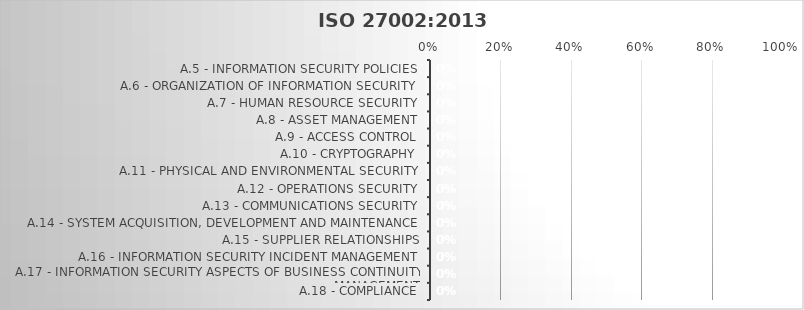
| Category | Implementation Score: |
|---|---|
| A.5 - Information Security Policies | 0 |
| A.6 - Organization of information security | 0 |
| A.7 - Human resource security | 0 |
| A.8 - Asset management | 0 |
| A.9 - Access control | 0 |
| A.10 - Cryptography | 0 |
| A.11 - Physical and environmental security | 0 |
| A.12 - Operations security | 0 |
| A.13 - Communications security | 0 |
| A.14 - System acquisition, development and maintenance | 0 |
| A.15 - Supplier relationships | 0 |
| A.16 - Information security incident management | 0 |
| A.17 - Information security aspects of business continuity management | 0 |
| A.18 - Compliance | 0 |